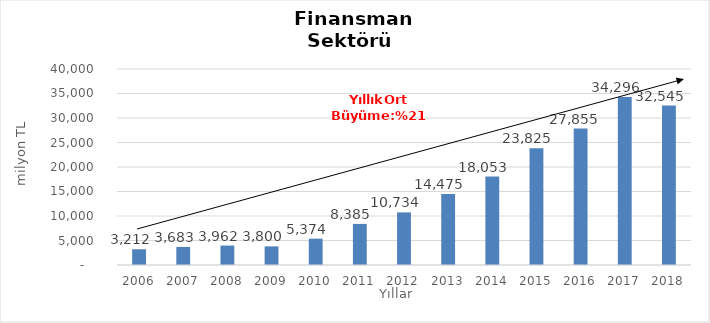
| Category | Finansman |
|---|---|
| 2006.0 | 3212.153 |
| 2007.0 | 3682.969 |
| 2008.0 | 3962.227 |
| 2009.0 | 3800.05 |
| 2010.0 | 5373.931 |
| 2011.0 | 8385.227 |
| 2012.0 | 10734.23 |
| 2013.0 | 14474.899 |
| 2014.0 | 18053.437 |
| 2015.0 | 23825 |
| 2016.0 | 27855 |
| 2017.0 | 34296 |
| 2018.0 | 32545 |